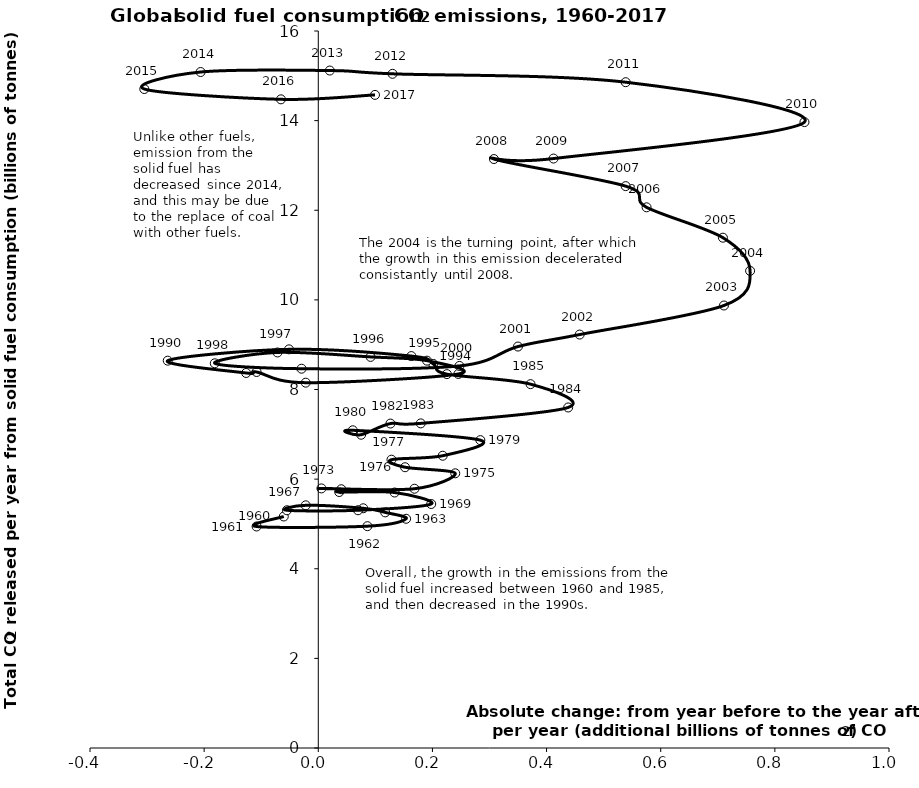
| Category | Series 0 |
|---|---|
| -0.06045599999999984 | 5.166 |
| -0.10808799999999996 | 4.943 |
| 0.08610399999999974 | 4.95 |
| 0.15388800000000025 | 5.115 |
| 0.11724800000000046 | 5.258 |
| 0.07877599999999951 | 5.349 |
| -0.021984000000000226 | 5.415 |
| -0.0549599999999999 | 5.305 |
| 0.0696159999999999 | 5.305 |
| 0.19785600000000025 | 5.445 |
| 0.1337360000000003 | 5.701 |
| 0.036639999999999784 | 5.712 |
| 0.040303999999999895 | 5.774 |
| 0.005495999999999945 | 5.793 |
| 0.16854400000000025 | 5.785 |
| 0.23999199999999998 | 6.13 |
| 0.15205599999999997 | 6.265 |
| 0.12824000000000035 | 6.434 |
| 0.21800799999999976 | 6.522 |
| 0.28396 | 6.87 |
| 0.06045599999999984 | 7.09 |
| 0.07511199999999985 | 6.991 |
| 0.12640800000000052 | 7.24 |
| 0.1795359999999997 | 7.244 |
| 0.4378479999999998 | 7.599 |
| 0.37189600000000045 | 8.119 |
| 0.22533599999999954 | 8.343 |
| 0.20151999999999948 | 8.57 |
| 0.16304800000000075 | 8.746 |
| -0.051295999999999786 | 8.896 |
| -0.26380800000000093 | 8.643 |
| -0.12640799999999963 | 8.369 |
| -0.10808799999999952 | 8.391 |
| -0.02198399999999978 | 8.152 |
| 0.24548799999999993 | 8.347 |
| 0.1905279999999996 | 8.643 |
| 0.09159999999999968 | 8.728 |
| -0.07144800000000018 | 8.827 |
| -0.18136799999999909 | 8.585 |
| -0.029312000000000005 | 8.464 |
| 0.24731999999999932 | 8.526 |
| 0.3499119999999998 | 8.958 |
| 0.4580000000000002 | 9.226 |
| 0.7108160000000003 | 9.874 |
| 0.7566160000000002 | 10.648 |
| 0.7089840000000001 | 11.388 |
| 0.5752480000000002 | 12.066 |
| 0.5386080000000009 | 12.538 |
| 0.3077759999999996 | 13.143 |
| 0.41219999999999857 | 13.154 |
| 0.8518799999999995 | 13.967 |
| 0.5386080000000009 | 14.858 |
| 0.13007200000000108 | 15.044 |
| 0.020151999999999504 | 15.118 |
| -0.20623395876251482 | 15.085 |
| -0.30487280633341296 | 14.705 |
| -0.065439362388922 | 14.475 |
| 0.09937497036395371 | 14.574 |